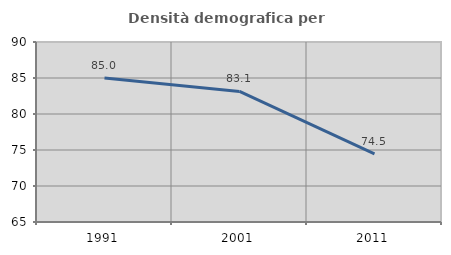
| Category | Densità demografica |
|---|---|
| 1991.0 | 84.992 |
| 2001.0 | 83.127 |
| 2011.0 | 74.473 |